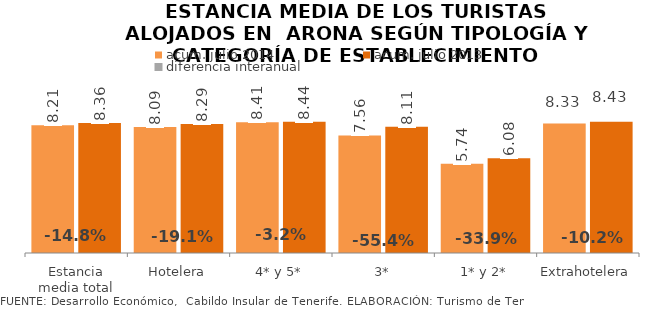
| Category | acum. julio 2014 | acum. julio 2013 |
|---|---|---|
| Estancia media total | 8.211 | 8.359 |
| Hotelera | 8.095 | 8.285 |
| 4* y 5* | 8.408 | 8.441 |
| 3* | 7.555 | 8.109 |
| 1* y 2* | 5.745 | 6.084 |
| Extrahotelera | 8.33 | 8.432 |